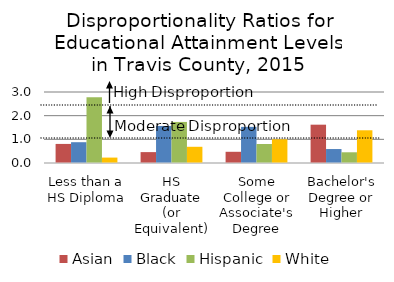
| Category | Asian | Black | Hispanic | White |
|---|---|---|---|---|
| Less than a HS Diploma | 0.806 | 0.879 | 2.779 | 0.229 |
| HS Graduate (or Equivalent) | 0.46 | 1.566 | 1.735 | 0.685 |
| Some College or Associate's Degree | 0.474 | 1.526 | 0.804 | 1.003 |
| Bachelor's Degree or Higher | 1.619 | 0.59 | 0.453 | 1.383 |